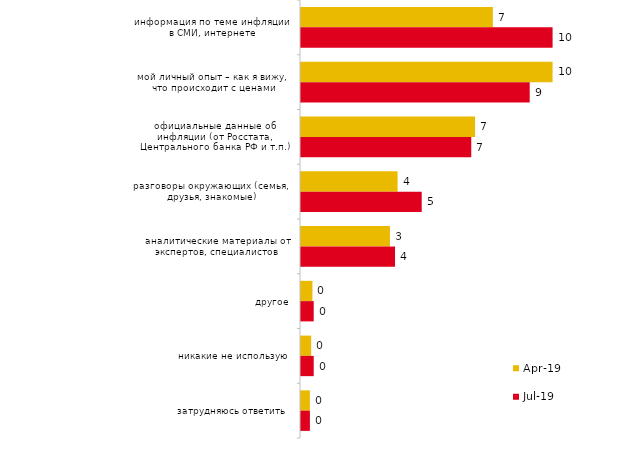
| Category | апр.19 | июл.19 |
|---|---|---|
| информация по теме инфляции в СМИ, интернете | 7.475 | 9.802 |
| мой личный опыт – как я вижу, что происходит с ценами | 9.802 | 8.911 |
| официальные данные об инфляции (от Росстата, Центрального банка РФ и т.п.) | 6.782 | 6.634 |
| разговоры окружающих (семья, друзья, знакомые) | 3.762 | 4.703 |
| аналитические материалы от экспертов, специалистов | 3.465 | 3.663 |
| другое | 0.446 | 0.495 |
| никакие не использую | 0.396 | 0.495 |
| затрудняюсь ответить | 0.347 | 0.347 |